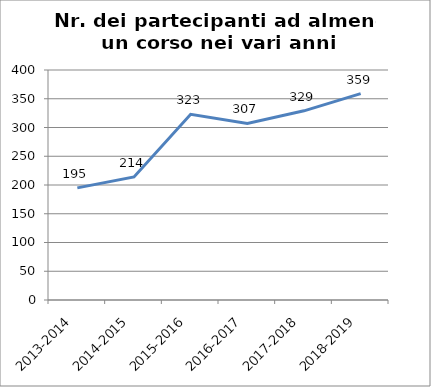
| Category | Nr. Partecipanti ad almeno un Corso |
|---|---|
| 2013-2014 | 195 |
| 2014-2015 | 214 |
| 2015-2016 | 323 |
| 2016-2017 | 307 |
| 2017-2018 | 329 |
| 2018-2019 | 359 |